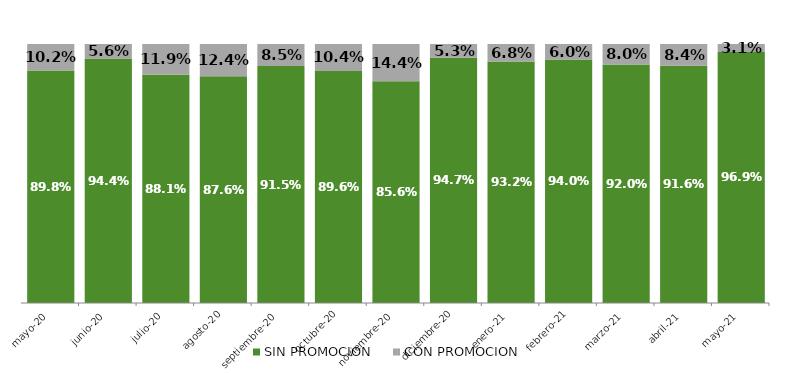
| Category | SIN PROMOCION   | CON PROMOCION   |
|---|---|---|
| 2020-05-01 | 0.898 | 0.102 |
| 2020-06-01 | 0.944 | 0.056 |
| 2020-07-01 | 0.881 | 0.119 |
| 2020-08-01 | 0.876 | 0.124 |
| 2020-09-01 | 0.915 | 0.085 |
| 2020-10-01 | 0.896 | 0.104 |
| 2020-11-01 | 0.856 | 0.144 |
| 2020-12-01 | 0.947 | 0.053 |
| 2021-01-01 | 0.932 | 0.068 |
| 2021-02-01 | 0.94 | 0.06 |
| 2021-03-01 | 0.92 | 0.08 |
| 2021-04-01 | 0.916 | 0.084 |
| 2021-05-01 | 0.969 | 0.031 |